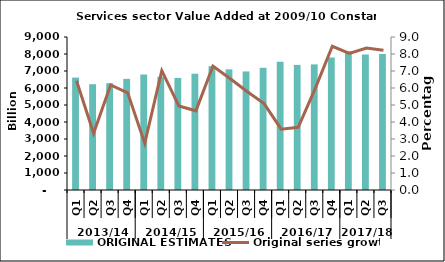
| Category | ORIGINAL ESTIMATES |
|---|---|
| 0 | 6612.793 |
| 1 | 6222.74 |
| 2 | 6281.1 |
| 3 | 6536.151 |
| 4 | 6794.173 |
| 5 | 6659.591 |
| 6 | 6591.37 |
| 7 | 6840.595 |
| 8 | 7289.572 |
| 9 | 7096.232 |
| 10 | 6973.399 |
| 11 | 7188.045 |
| 12 | 7550.545 |
| 13 | 7358.133 |
| 14 | 7390.068 |
| 15 | 7795.69 |
| 16 | 8157.448 |
| 17 | 7972.904 |
| 18 | 7997.582 |